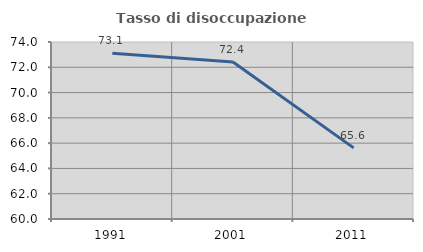
| Category | Tasso di disoccupazione giovanile  |
|---|---|
| 1991.0 | 73.118 |
| 2001.0 | 72.414 |
| 2011.0 | 65.625 |